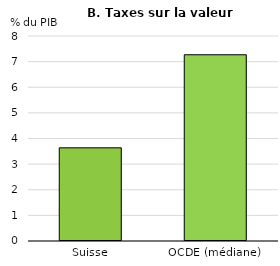
| Category | Taxes sur la valeur ajoutée | Series 1 |
|---|---|---|
| Suisse | 3.637 |  |
| OCDE (médiane) | 7.268 |  |